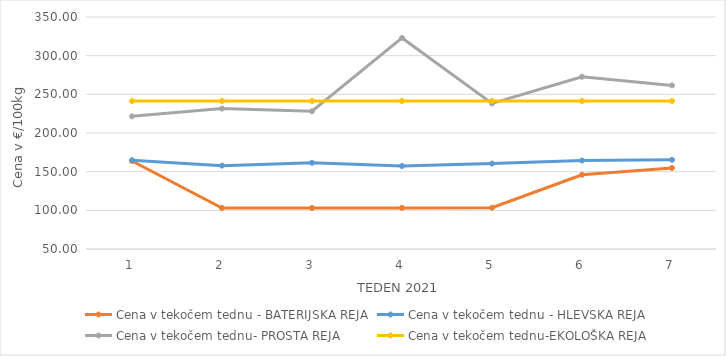
| Category | Cena v tekočem tednu - BATERIJSKA REJA | Cena v tekočem tednu - HLEVSKA REJA | Cena v tekočem tednu- PROSTA REJA | Cena v tekočem tednu-EKOLOŠKA REJA |
|---|---|---|---|---|
| 1.0 | 163.81 | 164.86 | 221.55 | 241.38 |
| 2.0 | 103.02 | 157.81 | 231.55 | 241.38 |
| 3.0 | 103.03 | 161.48 | 228.1 | 241.38 |
| 4.0 | 103.15 | 157.29 | 322.93 | 241.38 |
| 5.0 | 103.34 | 160.43 | 238.28 | 241.38 |
| 6.0 | 146.03 | 164.39 | 272.76 | 241.38 |
| 7.0 | 154.77 | 165.34 | 261.55 | 241.38 |